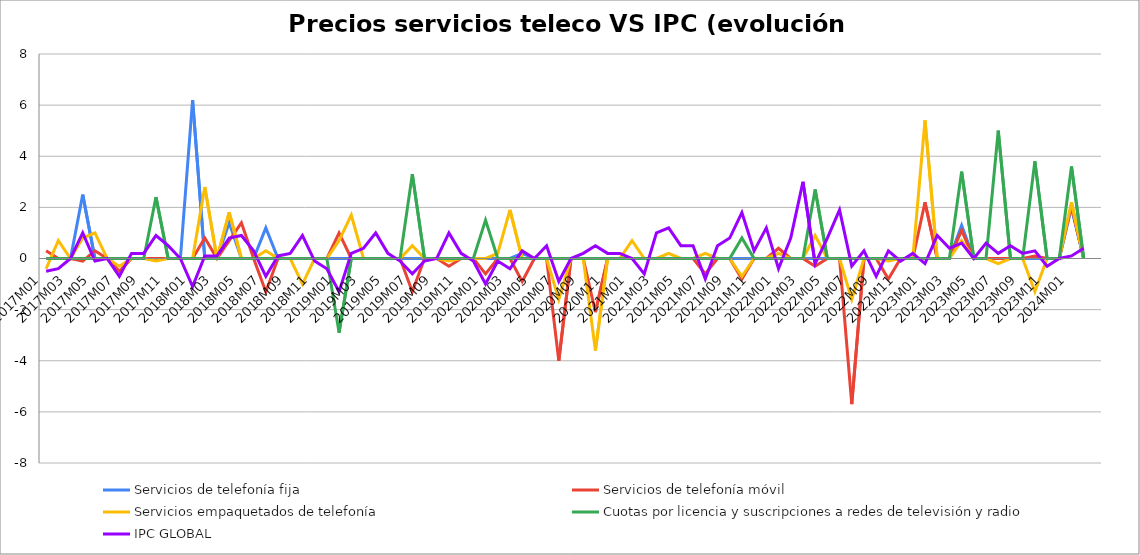
| Category | Servicios de telefonía fija | Servicios de telefonía móvil | Servicios empaquetados de telefonía | Cuotas por licencia y suscripciones a redes de televisión y radio | IPC GLOBAL |
|---|---|---|---|---|---|
| 2017M01 | 0 | 0.3 | -0.4 | 0 | -0.5 |
| 2017M02 | 0 | 0 | 0.7 | 0 | -0.4 |
| 2017M03 | 0 | 0 | 0 | 0 | 0 |
| 2017M04 | 2.5 | -0.1 | 0.8 | 0 | 1 |
| 2017M05 | 0 | 0.3 | 1 | 0 | -0.1 |
| 2017M06 | 0 | 0 | 0 | 0 | 0 |
| 2017M07 | 0 | -0.5 | -0.3 | 0 | -0.7 |
| 2017M08 | 0 | 0 | 0 | 0 | 0.2 |
| 2017M09 | 0 | 0 | 0 | 0 | 0.2 |
| 2017M10 | 0 | 0 | -0.1 | 2.4 | 0.9 |
| 2017M11 | 0 | 0 | 0 | 0 | 0.5 |
| 2017M12 | 0 | 0 | 0 | 0 | 0 |
| 2018M01 | 6.2 | 0 | 0 | 0 | -1.1 |
| 2018M02 | 0 | 0.8 | 2.8 | 0 | 0.1 |
| 2018M03 | 0 | 0 | 0 | 0 | 0.1 |
| 2018M04 | 1.4 | 0.7 | 1.8 | 0 | 0.8 |
| 2018M05 | 0 | 1.4 | 0 | 0 | 0.9 |
| 2018M06 | 0 | 0 | 0 | 0 | 0.3 |
| 2018M07 | 1.2 | -1.3 | 0.3 | 0 | -0.7 |
| 2018M08 | 0 | 0 | 0 | 0 | 0.1 |
| 2018M09 | 0 | 0 | 0 | 0 | 0.2 |
| 2018M10 | 0 | 0 | -1 | 0 | 0.9 |
| 2018M11 | 0 | 0 | 0 | 0 | -0.1 |
| 2018M12 | 0 | 0 | 0 | 0 | -0.4 |
| 2019M01 | 0 | 1 | 0.7 | -2.9 | -1.3 |
| 2019M02 | 0 | 0 | 1.7 | 0 | 0.2 |
| 2019M03 | 0 | 0 | 0 | 0 | 0.4 |
| 2019M04 | 0 | 0 | 0 | 0 | 1 |
| 2019M05 | 0 | 0 | 0 | 0 | 0.2 |
| 2019M06 | 0 | 0 | 0 | 0 | -0.1 |
| 2019M07 | 0 | -1.3 | 0.5 | 3.3 | -0.6 |
| 2019M08 | 0 | 0 | 0 | 0 | -0.1 |
| 2019M09 | 0 | 0 | 0 | 0 | 0 |
| 2019M10 | 0 | -0.3 | -0.1 | 0 | 1 |
| 2019M11 | 0 | 0 | 0 | 0 | 0.2 |
| 2019M12 | 0 | 0 | 0 | 0 | -0.1 |
| 2020M01 | 0 | -0.6 | 0 | 1.5 | -1 |
| 2020M02 | 0 | 0 | 0.2 | 0 | -0.1 |
| 2020M03 | 0 | 0 | 1.9 | 0 | -0.4 |
| 2020M04 | 0.2 | -0.9 | 0 | 0 | 0.3 |
| 2020M05 | 0 | 0 | 0 | 0 | 0 |
| 2020M06 | 0 | 0 | 0 | 0 | 0.5 |
| 2020M07 | 0 | -4 | -1.6 | 0 | -0.9 |
| 2020M08 | 0 | 0 | 0 | 0 | 0 |
| 2020M09 | 0 | 0 | 0 | 0 | 0.2 |
| 2020M10 | 0 | -2.1 | -3.6 | 0 | 0.5 |
| 2020M11 | 0 | 0 | 0 | 0 | 0.2 |
| 2020M12 | 0 | 0 | 0 | 0 | 0.2 |
| 2021M01 | 0 | 0 | 0.7 | 0 | 0 |
| 2021M02 | 0 | 0 | 0 | 0 | -0.6 |
| 2021M03 | 0 | 0 | 0 | 0 | 1 |
| 2021M04 | 0 | 0 | 0.2 | 0 | 1.2 |
| 2021M05 | 0 | 0 | 0 | 0 | 0.5 |
| 2021M06 | 0 | 0 | 0 | 0 | 0.5 |
| 2021M07 | 0 | -0.6 | 0.2 | 0 | -0.8 |
| 2021M08 | 0 | 0 | 0 | 0 | 0.5 |
| 2021M09 | 0 | 0 | 0 | 0 | 0.8 |
| 2021M10 | 0 | -0.8 | -0.7 | 0.8 | 1.8 |
| 2021M11 | 0 | 0 | 0 | 0 | 0.3 |
| 2021M12 | 0 | 0 | 0 | 0 | 1.2 |
| 2022M01 | 0 | 0.4 | 0.2 | 0 | -0.4 |
| 2022M02 | 0 | 0 | 0 | 0 | 0.8 |
| 2022M03 | 0 | 0 | 0 | 0 | 3 |
| 2022M04 | 0 | -0.3 | 0.9 | 2.7 | -0.2 |
| 2022M05 | 0 | 0 | 0 | 0 | 0.8 |
| 2022M06 | 0 | 0 | 0 | 0 | 1.9 |
| 2022M07 | 0 | -5.7 | -1.6 | 0 | -0.3 |
| 2022M08 | 0 | 0 | 0 | 0 | 0.3 |
| 2022M09 | 0 | 0 | 0 | 0 | -0.7 |
| 2022M10 | 0 | -0.8 | -0.1 | 0 | 0.3 |
| 2022M11 | 0 | 0 | 0 | 0 | -0.1 |
| 2022M12 | 0 | 0 | 0 | 0 | 0.2 |
| 2023M01 | 0 | 2.2 | 5.4 | 0 | -0.2 |
| 2023M02 | 0 | 0 | 0 | 0 | 0.9 |
| 2023M03 | 0 | 0 | 0 | 0 | 0.4 |
| 2023M04 | 1.3 | 1.1 | 0.7 | 3.4 | 0.6 |
| 2023M05 | 0 | 0 | 0 | 0 | 0 |
| 2023M06 | 0 | 0 | 0 | 0 | 0.6 |
| 2023M07 | 0 | 0 | -0.2 | 5 | 0.2 |
| 2023M08 | 0 | 0 | 0 | 0 | 0.5 |
| 2023M09 | 0 | 0 | 0 | 0 | 0.2 |
| 2023M10 | 0 | 0.1 | -1.3 | 3.8 | 0.3 |
| 2023M11 | 0 | 0 | 0 | 0 | -0.3 |
| 2023M12 | 0 | 0 | 0 | 0 | 0 |
| 2024M01 | 2 | 2.1 | 2.2 | 3.6 | 0.1 |
| 2024M02 | 0 | 0 | 0 | 0 | 0.4 |